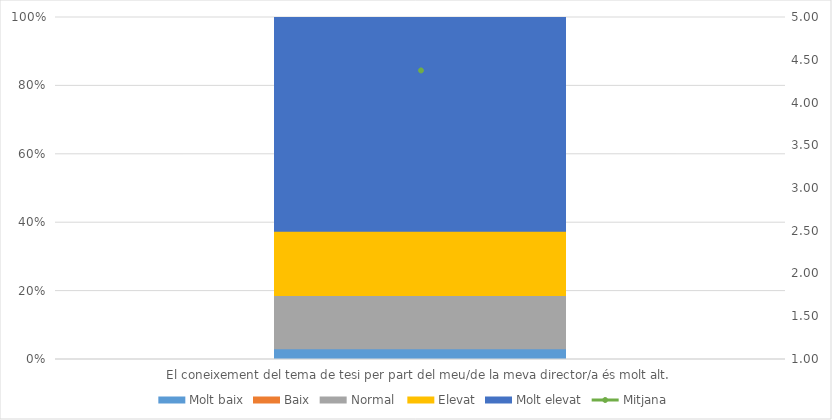
| Category | Molt baix | Baix | Normal  | Elevat | Molt elevat |
|---|---|---|---|---|---|
| El coneixement del tema de tesi per part del meu/de la meva director/a és molt alt. | 1 | 0 | 5 | 6 | 20 |